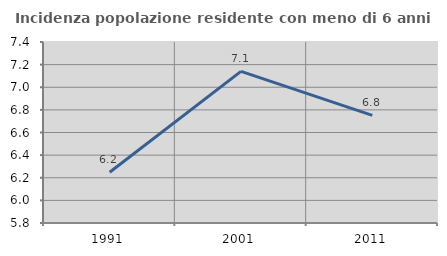
| Category | Incidenza popolazione residente con meno di 6 anni |
|---|---|
| 1991.0 | 6.249 |
| 2001.0 | 7.14 |
| 2011.0 | 6.751 |